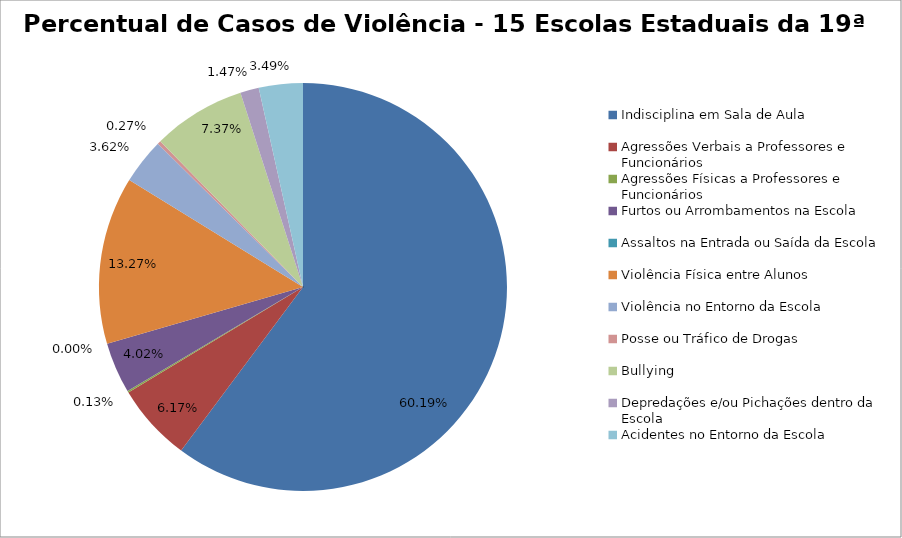
| Category | Percentual |
|---|---|
| Indisciplina em Sala de Aula | 0.602 |
| Agressões Verbais a Professores e Funcionários | 0.062 |
| Agressões Físicas a Professores e Funcionários | 0.001 |
| Furtos ou Arrombamentos na Escola | 0.04 |
| Assaltos na Entrada ou Saída da Escola | 0 |
| Violência Física entre Alunos | 0.133 |
| Violência no Entorno da Escola | 0.036 |
| Posse ou Tráfico de Drogas | 0.003 |
| Bullying | 0.074 |
| Depredações e/ou Pichações dentro da Escola | 0.015 |
| Acidentes no Entorno da Escola | 0.035 |